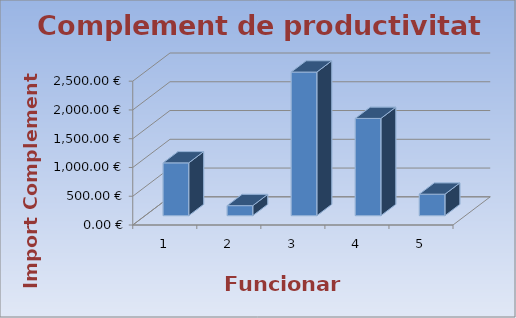
| Category | Series 0 |
|---|---|
| 0 | 917.223 |
| 1 | 173.893 |
| 2 | 2495.931 |
| 3 | 1690.107 |
| 4 | 372.846 |